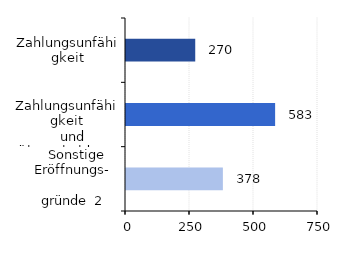
| Category | Series 0 |
|---|---|
| Zahlungsunfähigkeit | 270.461 |
|   Zahlungsunfähigkeit
   und Überschuldung | 582.529 |
|   Sonstige Eröffnungs-
                      gründe  2 | 378.368 |